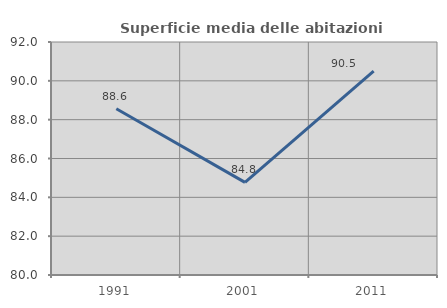
| Category | Superficie media delle abitazioni occupate |
|---|---|
| 1991.0 | 88.561 |
| 2001.0 | 84.769 |
| 2011.0 | 90.504 |